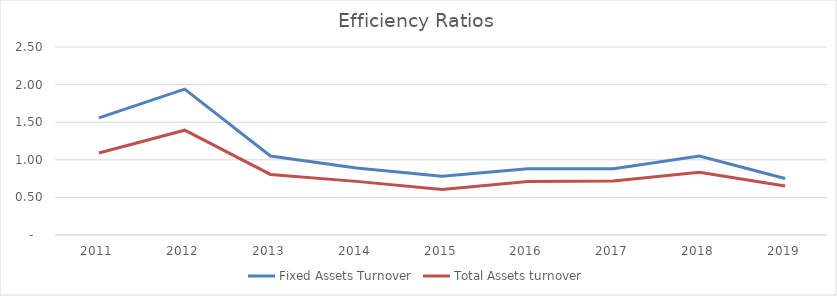
| Category | Fixed Assets Turnover | Total Assets turnover |
|---|---|---|
| 2011.0 | 1.558 | 1.091 |
| 2012.0 | 1.941 | 1.393 |
| 2013.0 | 1.051 | 0.806 |
| 2014.0 | 0.891 | 0.713 |
| 2015.0 | 0.781 | 0.605 |
| 2016.0 | 0.88 | 0.712 |
| 2017.0 | 0.88 | 0.719 |
| 2018.0 | 1.051 | 0.836 |
| 2019.0 | 0.751 | 0.653 |